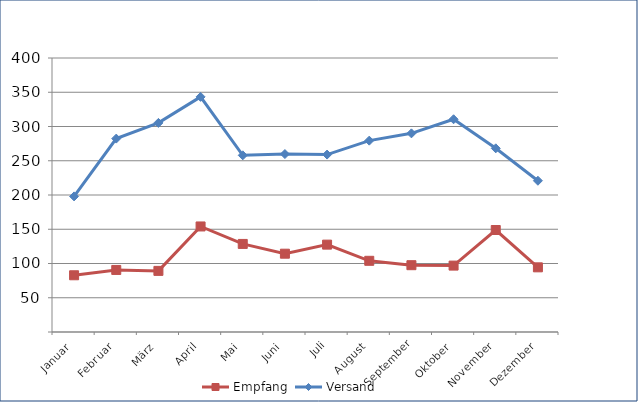
| Category | Empfang | Versand |
|---|---|---|
| Januar | 82.823 | 197.968 |
| Februar | 90.602 | 282.328 |
| März | 89.227 | 305.267 |
| April | 154.074 | 343.254 |
| Mai | 128.564 | 257.92 |
| Juni | 114.311 | 259.779 |
| Juli | 127.535 | 258.997 |
| August | 103.928 | 279.352 |
| September | 97.528 | 290.002 |
| Oktober | 96.939 | 310.568 |
| November | 148.897 | 268.139 |
| Dezember | 94.392 | 220.809 |